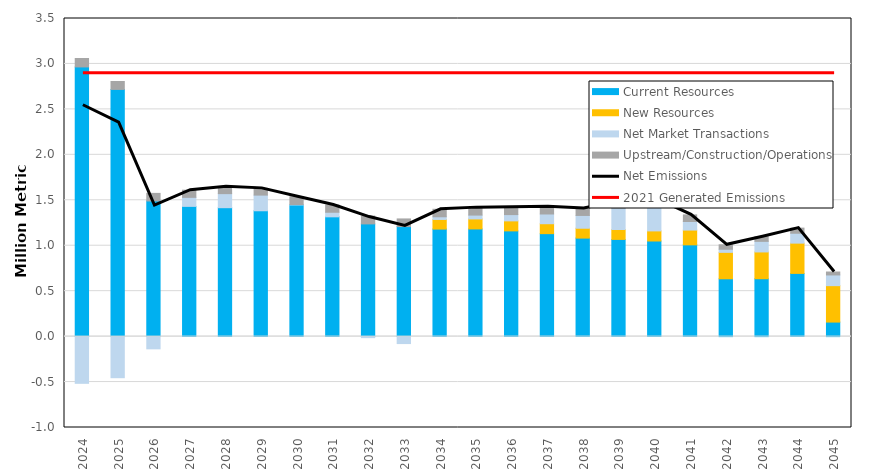
| Category | Current Resources | New Resources | Net Market Transactions | Upstream/Construction/Operations |
|---|---|---|---|---|
| 2024.0 | 2.967 | 0 | -0.514 | 0.093 |
| 2025.0 | 2.72 | 0 | -0.452 | 0.087 |
| 2026.0 | 1.492 | 0 | -0.135 | 0.084 |
| 2027.0 | 1.433 | 0 | 0.099 | 0.079 |
| 2028.0 | 1.418 | 0 | 0.155 | 0.076 |
| 2029.0 | 1.385 | 0 | 0.172 | 0.074 |
| 2030.0 | 1.448 | 0 | 0.005 | 0.086 |
| 2031.0 | 1.318 | 0 | 0.05 | 0.08 |
| 2032.0 | 1.24 | 0 | -0.011 | 0.086 |
| 2033.0 | 1.21 | 0 | -0.077 | 0.084 |
| 2034.0 | 1.183 | 0.106 | 0.029 | 0.082 |
| 2035.0 | 1.185 | 0.11 | 0.042 | 0.082 |
| 2036.0 | 1.163 | 0.11 | 0.069 | 0.081 |
| 2037.0 | 1.133 | 0.109 | 0.107 | 0.079 |
| 2038.0 | 1.084 | 0.108 | 0.141 | 0.076 |
| 2039.0 | 1.069 | 0.109 | 0.237 | 0.075 |
| 2040.0 | 1.052 | 0.111 | 0.285 | 0.074 |
| 2041.0 | 1.01 | 0.162 | 0.094 | 0.073 |
| 2042.0 | 0.636 | 0.291 | 0.034 | 0.049 |
| 2043.0 | 0.637 | 0.295 | 0.116 | 0.051 |
| 2044.0 | 0.695 | 0.333 | 0.109 | 0.056 |
| 2045.0 | 0.16 | 0.401 | 0.118 | 0.032 |